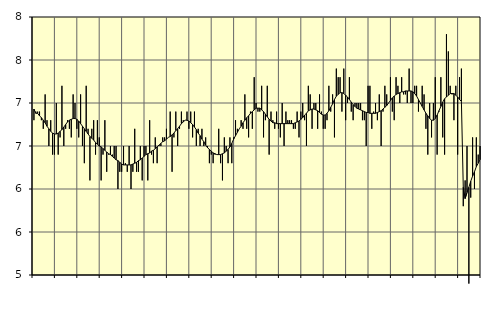
| Category | Piggar | Transport, SNI 49-53 |
|---|---|---|
| nan | 6.8 | 6.93 |
| 1.0 | 6.9 | 6.88 |
| 1.0 | 6.9 | 6.88 |
| 1.0 | 6.9 | 6.85 |
| 1.0 | 6.8 | 6.83 |
| 1.0 | 6.7 | 6.8 |
| 1.0 | 7.1 | 6.77 |
| 1.0 | 6.8 | 6.73 |
| 1.0 | 6.5 | 6.7 |
| 1.0 | 6.8 | 6.67 |
| 1.0 | 6.4 | 6.65 |
| 1.0 | 6.4 | 6.64 |
| nan | 7 | 6.64 |
| 2.0 | 6.4 | 6.65 |
| 2.0 | 6.6 | 6.67 |
| 2.0 | 7.2 | 6.69 |
| 2.0 | 6.5 | 6.72 |
| 2.0 | 6.7 | 6.75 |
| 2.0 | 6.8 | 6.78 |
| 2.0 | 6.7 | 6.8 |
| 2.0 | 6.6 | 6.81 |
| 2.0 | 7.1 | 6.82 |
| 2.0 | 7 | 6.82 |
| 2.0 | 6.7 | 6.81 |
| nan | 6.6 | 6.79 |
| 3.0 | 7.1 | 6.76 |
| 3.0 | 6.5 | 6.73 |
| 3.0 | 6.3 | 6.7 |
| 3.0 | 7.2 | 6.67 |
| 3.0 | 6.7 | 6.64 |
| 3.0 | 6.1 | 6.61 |
| 3.0 | 6.7 | 6.59 |
| 3.0 | 6.8 | 6.57 |
| 3.0 | 6.4 | 6.54 |
| 3.0 | 6.8 | 6.52 |
| 3.0 | 6.6 | 6.5 |
| nan | 6.1 | 6.49 |
| 4.0 | 6.4 | 6.47 |
| 4.0 | 6.8 | 6.45 |
| 4.0 | 6.2 | 6.43 |
| 4.0 | 6.4 | 6.41 |
| 4.0 | 6.5 | 6.4 |
| 4.0 | 6.4 | 6.38 |
| 4.0 | 6.5 | 6.36 |
| 4.0 | 6.5 | 6.34 |
| 4.0 | 6 | 6.33 |
| 4.0 | 6.2 | 6.31 |
| 4.0 | 6.2 | 6.29 |
| nan | 6.5 | 6.28 |
| 5.0 | 6.3 | 6.28 |
| 5.0 | 6.2 | 6.28 |
| 5.0 | 6.5 | 6.28 |
| 5.0 | 6 | 6.28 |
| 5.0 | 6.2 | 6.29 |
| 5.0 | 6.7 | 6.3 |
| 5.0 | 6.2 | 6.31 |
| 5.0 | 6.2 | 6.33 |
| 5.0 | 6.5 | 6.34 |
| 5.0 | 6.1 | 6.36 |
| 5.0 | 6.5 | 6.38 |
| nan | 6.5 | 6.4 |
| 6.0 | 6.1 | 6.41 |
| 6.0 | 6.8 | 6.42 |
| 6.0 | 6.4 | 6.44 |
| 6.0 | 6.3 | 6.45 |
| 6.0 | 6.6 | 6.47 |
| 6.0 | 6.3 | 6.49 |
| 6.0 | 6.5 | 6.51 |
| 6.0 | 6.5 | 6.53 |
| 6.0 | 6.6 | 6.55 |
| 6.0 | 6.6 | 6.56 |
| 6.0 | 6.7 | 6.58 |
| nan | 6.6 | 6.6 |
| 7.0 | 6.9 | 6.61 |
| 7.0 | 6.2 | 6.63 |
| 7.0 | 6.6 | 6.65 |
| 7.0 | 6.9 | 6.68 |
| 7.0 | 6.5 | 6.7 |
| 7.0 | 6.7 | 6.73 |
| 7.0 | 6.9 | 6.76 |
| 7.0 | 6.8 | 6.78 |
| 7.0 | 6.8 | 6.8 |
| 7.0 | 6.9 | 6.8 |
| 7.0 | 6.7 | 6.79 |
| nan | 6.9 | 6.77 |
| 8.0 | 6.6 | 6.75 |
| 8.0 | 6.9 | 6.72 |
| 8.0 | 6.5 | 6.69 |
| 8.0 | 6.7 | 6.65 |
| 8.0 | 6.5 | 6.62 |
| 8.0 | 6.7 | 6.58 |
| 8.0 | 6.5 | 6.55 |
| 8.0 | 6.6 | 6.51 |
| 8.0 | 6.5 | 6.48 |
| 8.0 | 6.3 | 6.46 |
| 8.0 | 6.4 | 6.44 |
| nan | 6.3 | 6.42 |
| 9.0 | 6.4 | 6.41 |
| 9.0 | 6.4 | 6.4 |
| 9.0 | 6.7 | 6.4 |
| 9.0 | 6.3 | 6.4 |
| 9.0 | 6.1 | 6.41 |
| 9.0 | 6.6 | 6.42 |
| 9.0 | 6.5 | 6.44 |
| 9.0 | 6.3 | 6.46 |
| 9.0 | 6.6 | 6.49 |
| 9.0 | 6.3 | 6.53 |
| 9.0 | 6.6 | 6.58 |
| nan | 6.8 | 6.62 |
| 10.0 | 6.7 | 6.66 |
| 10.0 | 6.7 | 6.7 |
| 10.0 | 6.8 | 6.73 |
| 10.0 | 6.7 | 6.77 |
| 10.0 | 7.1 | 6.8 |
| 10.0 | 6.7 | 6.83 |
| 10.0 | 6.6 | 6.85 |
| 10.0 | 6.9 | 6.88 |
| 10.0 | 6.7 | 6.9 |
| 10.0 | 7.3 | 6.92 |
| 10.0 | 7 | 6.94 |
| nan | 6.9 | 6.94 |
| 11.0 | 6.9 | 6.94 |
| 11.0 | 7.2 | 6.92 |
| 11.0 | 6.6 | 6.9 |
| 11.0 | 6.8 | 6.87 |
| 11.0 | 7.2 | 6.84 |
| 11.0 | 6.4 | 6.81 |
| 11.0 | 6.9 | 6.79 |
| 11.0 | 6.8 | 6.77 |
| 11.0 | 6.7 | 6.77 |
| 11.0 | 6.9 | 6.76 |
| 11.0 | 6.7 | 6.76 |
| nan | 6.6 | 6.76 |
| 12.0 | 7 | 6.76 |
| 12.0 | 6.5 | 6.76 |
| 12.0 | 6.9 | 6.76 |
| 12.0 | 6.8 | 6.76 |
| 12.0 | 6.8 | 6.76 |
| 12.0 | 6.8 | 6.76 |
| 12.0 | 6.7 | 6.76 |
| 12.0 | 6.7 | 6.77 |
| 12.0 | 6.9 | 6.78 |
| 12.0 | 6.6 | 6.79 |
| 12.0 | 6.9 | 6.81 |
| nan | 7 | 6.83 |
| 13.0 | 6.8 | 6.86 |
| 13.0 | 6.5 | 6.88 |
| 13.0 | 7.2 | 6.91 |
| 13.0 | 7.1 | 6.92 |
| 13.0 | 6.7 | 6.93 |
| 13.0 | 7 | 6.93 |
| 13.0 | 7 | 6.92 |
| 13.0 | 6.7 | 6.91 |
| 13.0 | 7.1 | 6.89 |
| 13.0 | 6.9 | 6.87 |
| 13.0 | 6.7 | 6.86 |
| nan | 6.7 | 6.86 |
| 14.0 | 6.8 | 6.88 |
| 14.0 | 7.2 | 6.91 |
| 14.0 | 6.9 | 6.95 |
| 14.0 | 7.1 | 6.99 |
| 14.0 | 6.6 | 7.04 |
| 14.0 | 7.4 | 7.08 |
| 14.0 | 7.3 | 7.1 |
| 14.0 | 7.3 | 7.12 |
| 14.0 | 6.9 | 7.12 |
| 14.0 | 7.4 | 7.11 |
| 14.0 | 6.8 | 7.09 |
| nan | 7 | 7.07 |
| 15.0 | 7.3 | 7.04 |
| 15.0 | 6.9 | 7.01 |
| 15.0 | 6.8 | 6.98 |
| 15.0 | 7 | 6.96 |
| 15.0 | 7 | 6.94 |
| 15.0 | 7 | 6.93 |
| 15.0 | 7 | 6.92 |
| 15.0 | 6.8 | 6.91 |
| 15.0 | 6.8 | 6.9 |
| 15.0 | 6.5 | 6.89 |
| 15.0 | 7.2 | 6.89 |
| nan | 7.2 | 6.88 |
| 16.0 | 6.7 | 6.88 |
| 16.0 | 6.9 | 6.88 |
| 16.0 | 7 | 6.88 |
| 16.0 | 6.8 | 6.89 |
| 16.0 | 7.1 | 6.9 |
| 16.0 | 6.5 | 6.91 |
| 16.0 | 6.9 | 6.93 |
| 16.0 | 7.2 | 6.95 |
| 16.0 | 7.1 | 6.97 |
| 16.0 | 7 | 7 |
| 16.0 | 7.3 | 7.03 |
| nan | 6.9 | 7.06 |
| 17.0 | 6.8 | 7.08 |
| 17.0 | 7.3 | 7.1 |
| 17.0 | 7.2 | 7.11 |
| 17.0 | 7 | 7.12 |
| 17.0 | 7.3 | 7.13 |
| 17.0 | 7.1 | 7.13 |
| 17.0 | 7.1 | 7.14 |
| 17.0 | 7 | 7.14 |
| 17.0 | 7.4 | 7.14 |
| 17.0 | 7 | 7.14 |
| 17.0 | 7 | 7.13 |
| nan | 7.2 | 7.11 |
| 18.0 | 7.2 | 7.08 |
| 18.0 | 6.9 | 7.04 |
| 18.0 | 7 | 7 |
| 18.0 | 7.2 | 6.96 |
| 18.0 | 7.1 | 6.92 |
| 18.0 | 6.7 | 6.88 |
| 18.0 | 6.4 | 6.85 |
| 18.0 | 7 | 6.82 |
| 18.0 | 6.6 | 6.8 |
| 18.0 | 7 | 6.8 |
| 18.0 | 7.3 | 6.82 |
| nan | 6.4 | 6.86 |
| 19.0 | 6.9 | 6.91 |
| 19.0 | 7.3 | 6.96 |
| 19.0 | 6.6 | 7.01 |
| 19.0 | 6.4 | 7.05 |
| 19.0 | 7.8 | 7.07 |
| 19.0 | 7.6 | 7.09 |
| 19.0 | 7.2 | 7.11 |
| 19.0 | 7.1 | 7.11 |
| 19.0 | 6.8 | 7.11 |
| 19.0 | 7.2 | 7.09 |
| 19.0 | 6.4 | 7.07 |
| nan | 7.3 | 7.04 |
| 20.0 | 7.4 | 7.02 |
| 20.0 | 5.8 | 6.02 |
| 20.0 | 6.1 | 5.89 |
| 20.0 | 6.5 | 5.96 |
| 20.0 | 4.9 | 6.02 |
| 20.0 | 5.9 | 6.09 |
| 20.0 | 6.6 | 6.15 |
| 20.0 | 6 | 6.2 |
| 20.0 | 6.6 | 6.26 |
| 20.0 | 6.4 | 6.3 |
| 20.0 | 6.5 | 6.34 |